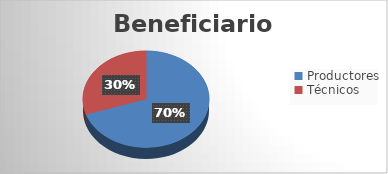
| Category | Series 0 |
|---|---|
| Productores | 201 |
| Técnicos | 87 |